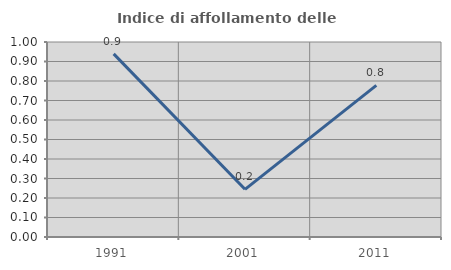
| Category | Indice di affollamento delle abitazioni  |
|---|---|
| 1991.0 | 0.939 |
| 2001.0 | 0.244 |
| 2011.0 | 0.777 |